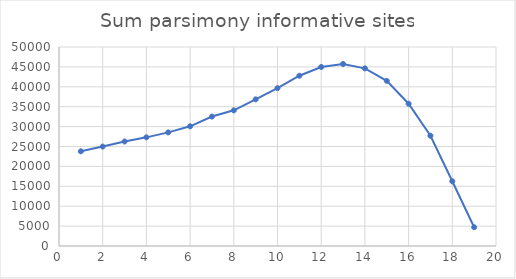
| Category | Series 0 |
|---|---|
| 0 | 23796 |
| 1 | 24986 |
| 2 | 26256 |
| 3 | 27298 |
| 4 | 28543 |
| 5 | 30075 |
| 6 | 32521 |
| 7 | 34087 |
| 8 | 36843 |
| 9 | 39657 |
| 10 | 42781 |
| 11 | 44979 |
| 12 | 45725 |
| 13 | 44629 |
| 14 | 41487 |
| 15 | 35742 |
| 16 | 27702 |
| 17 | 16258 |
| 18 | 4713 |